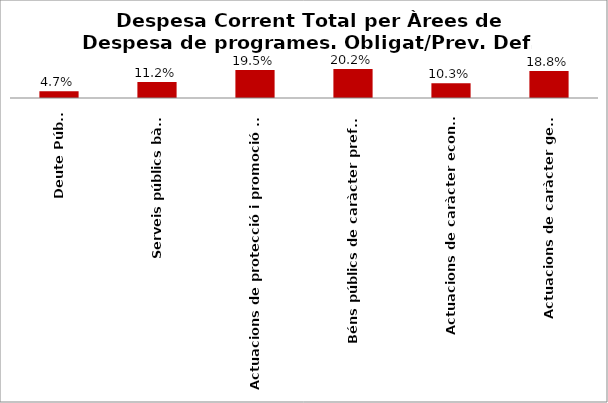
| Category | Series 0 |
|---|---|
| Deute Públic | 0.047 |
| Serveis públics bàsics | 0.112 |
| Actuacions de protecció i promoció social | 0.195 |
| Béns públics de caràcter preferent | 0.202 |
| Actuacions de caràcter econòmic | 0.103 |
| Actuacions de caràcter general | 0.188 |